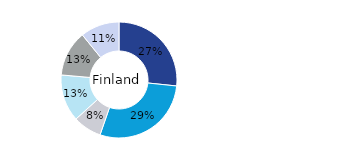
| Category | Finland |
|---|---|
| Kontor | 0.267 |
| Bostäder | 0.286 |
| Handel | 0.08 |
| Logistik* | 0.131 |
| Samhällsfastigheter | 0.127 |
| Övrigt | 0.109 |